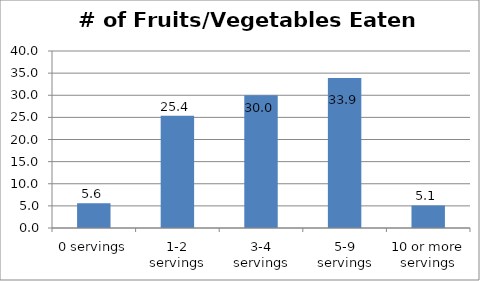
| Category | Series 0 |
|---|---|
| 0 servings | 5.608 |
| 1-2 servings | 25.377 |
| 3-4 servings | 30.015 |
| 5-9 servings | 33.895 |
| 10 or more servings | 5.105 |